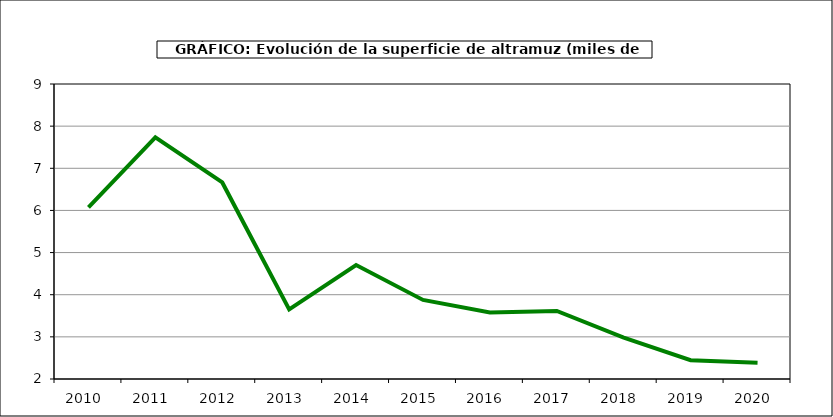
| Category | Superficie |
|---|---|
| 2010.0 | 6.074 |
| 2011.0 | 7.736 |
| 2012.0 | 6.664 |
| 2013.0 | 3.65 |
| 2014.0 | 4.706 |
| 2015.0 | 3.876 |
| 2016.0 | 3.577 |
| 2017.0 | 3.614 |
| 2018.0 | 2.984 |
| 2019.0 | 2.445 |
| 2020.0 | 2.386 |